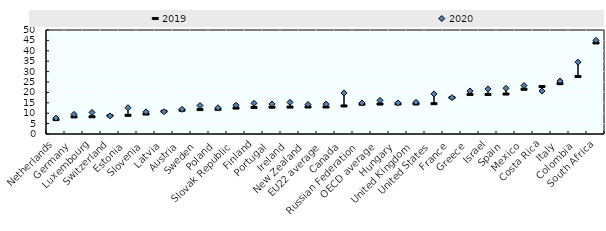
| Category | 2019 | 2020 |
|---|---|---|
| Netherlands | 6.926 | 7.645 |
| Germany | 8.223 | 9.429 |
| Luxembourg | 8.282 | 10.348 |
| Switzerland | 8.776 | 8.711 |
| Estonia | 9 | 12.625 |
| Slovenia | 9.597 | 10.642 |
| Latvia | 10.91 | 10.711 |
| Austria | 11.426 | 11.865 |
| Sweden | 11.74 | 13.692 |
| Poland | 11.873 | 12.614 |
| Slovak Republic | 12.475 | 13.843 |
| Finland | 12.755 | 14.776 |
| Portugal | 12.885 | 14.455 |
| Ireland | 12.942 | 15.209 |
| New Zealand | 12.971 | 14.21 |
| EU22 average | 12.986 | 14.36 |
| Canada | 13.484 | 19.753 |
| Russian Federation | 14.358 | 14.905 |
| OECD average | 14.408 | 16.143 |
| Hungary | 14.458 | 14.96 |
| United Kingdom | 14.473 | 15.228 |
| United States | 14.576 | 19.284 |
| France | 17.478 | 17.479 |
| Greece | 19.022 | 20.695 |
| Israel | 19.024 | 21.689 |
| Spain | 19.215 | 21.992 |
| Mexico | 21.5 | 23.292 |
| Costa Rica | 22.834 | 20.664 |
| Italy | 24.203 | 25.507 |
| Colombia | 27.623 | 34.544 |
| South Africa | 43.768 | 45.028 |